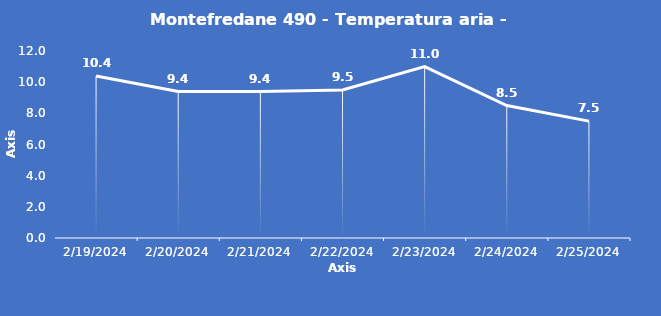
| Category | Montefredane 490 - Temperatura aria - Grezzo (°C) |
|---|---|
| 2/19/24 | 10.4 |
| 2/20/24 | 9.4 |
| 2/21/24 | 9.4 |
| 2/22/24 | 9.5 |
| 2/23/24 | 11 |
| 2/24/24 | 8.5 |
| 2/25/24 | 7.5 |